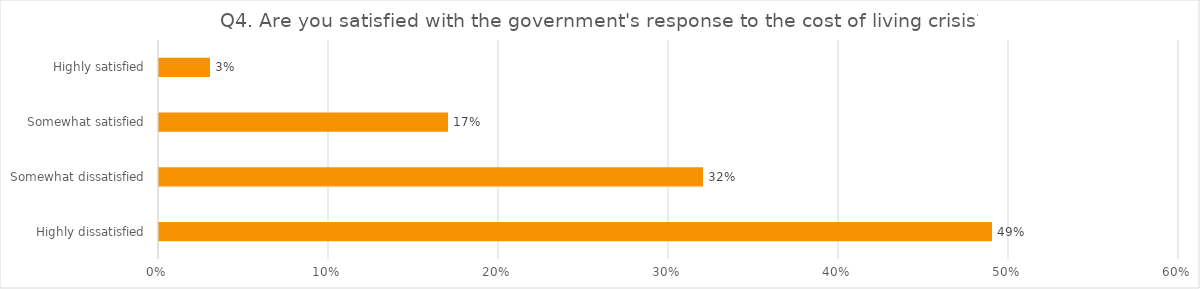
| Category | Q4. Are you satisfied with the government's response to the cost of living crisis? |
|---|---|
| Highly dissatisfied | 0.49 |
| Somewhat dissatisfied | 0.32 |
| Somewhat satisfied | 0.17 |
| Highly satisfied | 0.03 |